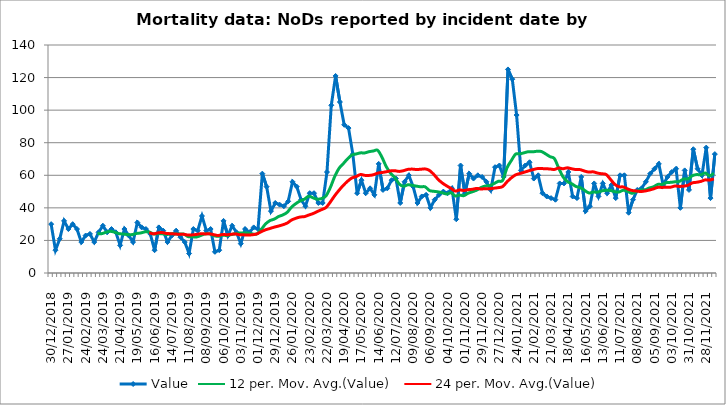
| Category | Value |
|---|---|
| 30/12/2018 | 30 |
| 06/01/2019 | 14 |
| 13/01/2019 | 21 |
| 20/01/2019 | 32 |
| 27/01/2019 | 27 |
| 03/02/2019 | 30 |
| 10/02/2019 | 27 |
| 17/02/2019 | 19 |
| 24/02/2019 | 23 |
| 03/03/2019 | 24 |
| 10/03/2019 | 19 |
| 17/03/2019 | 25 |
| 24/03/2019 | 29 |
| 31/03/2019 | 25 |
| 07/04/2019 | 27 |
| 14/04/2019 | 25 |
| 21/04/2019 | 17 |
| 28/04/2019 | 27 |
| 05/05/2019 | 23 |
| 12/05/2019 | 19 |
| 19/05/2019 | 31 |
| 26/05/2019 | 28 |
| 02/06/2019 | 27 |
| 09/06/2019 | 24 |
| 16/06/2019 | 14 |
| 23/06/2019 | 28 |
| 30/06/2019 | 26 |
| 07/07/2019 | 19 |
| 14/07/2019 | 23 |
| 21/07/2019 | 26 |
| 28/07/2019 | 22 |
| 04/08/2019 | 19 |
| 11/08/2019 | 12 |
| 18/08/2019 | 27 |
| 25/08/2019 | 26 |
| 01/09/2019 | 35 |
| 08/09/2019 | 26 |
| 15/09/2019 | 27 |
| 22/09/2019 | 13 |
| 29/09/2019 | 14 |
| 06/10/2019 | 32 |
| 13/10/2019 | 23 |
| 20/10/2019 | 29 |
| 27/10/2019 | 25 |
| 03/11/2019 | 18 |
| 10/11/2019 | 27 |
| 17/11/2019 | 25 |
| 24/11/2019 | 28 |
| 01/12/2019 | 27 |
| 08/12/2019 | 61 |
| 15/12/2019 | 53 |
| 22/12/2019 | 38 |
| 29/12/2019 | 43 |
| 05/01/2020 | 42 |
| 12/01/2020 | 41 |
| 19/01/2020 | 44 |
| 26/01/2020 | 56 |
| 02/02/2020 | 53 |
| 09/02/2020 | 45 |
| 16/02/2020 | 41 |
| 23/02/2020 | 49 |
| 01/03/2020 | 49 |
| 08/03/2020 | 43 |
| 15/03/2020 | 43 |
| 22/03/2020 | 62 |
| 29/03/2020 | 103 |
| 05/04/2020 | 121 |
| 12/04/2020 | 105 |
| 19/04/2020 | 91 |
| 26/04/2020 | 89 |
| 03/05/2020 | 73 |
| 10/05/2020 | 49 |
| 17/05/2020 | 57 |
| 24/05/2020 | 49 |
| 31/05/2020 | 52 |
| 07/06/2020 | 48 |
| 14/06/2020 | 67 |
| 21/06/2020 | 51 |
| 28/06/2020 | 52 |
| 05/07/2020 | 57 |
| 12/07/2020 | 58 |
| 19/07/2020 | 43 |
| 26/07/2020 | 56 |
| 02/08/2020 | 60 |
| 09/08/2020 | 53 |
| 16/08/2020 | 43 |
| 23/08/2020 | 47 |
| 30/08/2020 | 48 |
| 06/09/2020 | 40 |
| 13/09/2020 | 45 |
| 20/09/2020 | 48 |
| 27/09/2020 | 50 |
| 04/10/2020 | 49 |
| 11/10/2020 | 52 |
| 18/10/2020 | 33 |
| 25/10/2020 | 66 |
| 01/11/2020 | 49 |
| 08/11/2020 | 61 |
| 15/11/2020 | 58 |
| 22/11/2020 | 60 |
| 29/11/2020 | 59 |
| 06/12/2020 | 56 |
| 13/12/2020 | 51 |
| 20/12/2020 | 65 |
| 27/12/2020 | 66 |
| 03/01/2021 | 59 |
| 10/01/2021 | 125 |
| 17/01/2021 | 119 |
| 24/01/2021 | 97 |
| 31/01/2021 | 63 |
| 07/02/2021 | 66 |
| 14/02/2021 | 68 |
| 21/02/2021 | 58 |
| 28/02/2021 | 60 |
| 07/03/2021 | 49 |
| 14/03/2021 | 47 |
| 21/03/2021 | 46 |
| 28/03/2021 | 45 |
| 04/04/2021 | 55 |
| 11/04/2021 | 55 |
| 18/04/2021 | 62 |
| 25/04/2021 | 47 |
| 02/05/2021 | 46 |
| 09/05/2021 | 59 |
| 16/05/2021 | 38 |
| 23/05/2021 | 41 |
| 30/05/2021 | 55 |
| 06/06/2021 | 47 |
| 13/06/2021 | 55 |
| 20/06/2021 | 49 |
| 27/06/2021 | 54 |
| 04/07/2021 | 46 |
| 11/07/2021 | 60 |
| 18/07/2021 | 60 |
| 25/07/2021 | 37 |
| 01/08/2021 | 45 |
| 08/08/2021 | 51 |
| 15/08/2021 | 52 |
| 22/08/2021 | 56 |
| 29/08/2021 | 61 |
| 05/09/2021 | 64 |
| 12/09/2021 | 67 |
| 19/09/2021 | 54 |
| 26/09/2021 | 59 |
| 03/10/2021 | 62 |
| 10/10/2021 | 64 |
| 17/10/2021 | 40 |
| 24/10/2021 | 63 |
| 31/10/2021 | 51 |
| 07/11/2021 | 76 |
| 14/11/2021 | 64 |
| 21/11/2021 | 60 |
| 28/11/2021 | 77 |
| 05/12/2021 | 46 |
| 12/12/2021 | 73 |